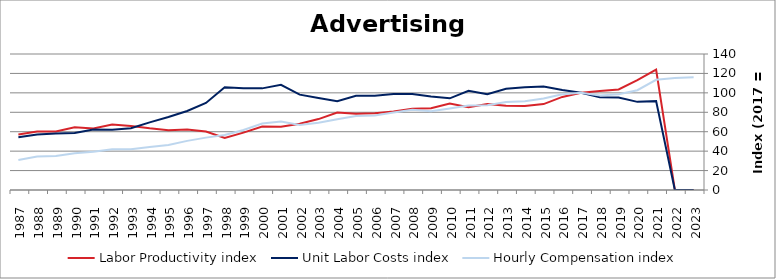
| Category | Labor Productivity index | Unit Labor Costs index | Hourly Compensation index |
|---|---|---|---|
| 2023.0 | 0 | 0 | 116.082 |
| 2022.0 | 0 | 0 | 115.241 |
| 2021.0 | 123.969 | 91.488 | 113.417 |
| 2020.0 | 113.211 | 90.729 | 102.716 |
| 2019.0 | 103.455 | 95.241 | 98.532 |
| 2018.0 | 101.823 | 95.539 | 97.28 |
| 2017.0 | 100 | 100 | 100 |
| 2016.0 | 95.807 | 102.874 | 98.56 |
| 2015.0 | 88.417 | 106.496 | 94.16 |
| 2014.0 | 86.407 | 105.743 | 91.369 |
| 2013.0 | 86.855 | 104.196 | 90.5 |
| 2012.0 | 88.477 | 98.646 | 87.279 |
| 2011.0 | 85.27 | 102.056 | 87.023 |
| 2010.0 | 88.908 | 94.341 | 83.877 |
| 2009.0 | 84.198 | 96.197 | 80.996 |
| 2008.0 | 83.596 | 98.773 | 82.57 |
| 2007.0 | 80.817 | 98.783 | 79.834 |
| 2006.0 | 79.067 | 97.115 | 76.786 |
| 2005.0 | 78.482 | 97.029 | 76.15 |
| 2004.0 | 79.787 | 91.336 | 72.874 |
| 2003.0 | 73.001 | 94.682 | 69.119 |
| 2002.0 | 68.218 | 98.195 | 66.987 |
| 2001.0 | 65.094 | 108.308 | 70.502 |
| 2000.0 | 65.408 | 104.616 | 68.427 |
| 1999.0 | 59.081 | 104.646 | 61.826 |
| 1998.0 | 53.486 | 105.817 | 56.598 |
| 1997.0 | 60.165 | 89.618 | 53.919 |
| 1996.0 | 62.194 | 81.316 | 50.574 |
| 1995.0 | 61.564 | 75.142 | 46.26 |
| 1994.0 | 63.459 | 69.596 | 44.165 |
| 1993.0 | 65.997 | 63.519 | 41.921 |
| 1992.0 | 67.483 | 62.08 | 41.893 |
| 1991.0 | 63.389 | 62.167 | 39.407 |
| 1990.0 | 64.525 | 58.739 | 37.901 |
| 1989.0 | 60.333 | 58.219 | 35.126 |
| 1988.0 | 60.204 | 57.185 | 34.428 |
| 1987.0 | 57.123 | 54.212 | 30.968 |